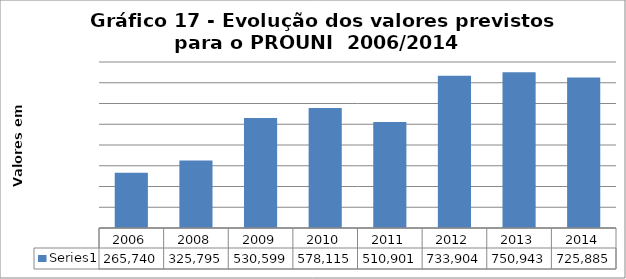
| Category | Series 0 |
|---|---|
| 2006.0 | 265740831 |
| 2008.0 | 325795326 |
| 2009.0 | 530599079 |
| 2010.0 | 578115899 |
| 2011.0 | 510901338 |
| 2012.0 | 733904013 |
| 2013.0 | 750943828 |
| 2014.0 | 725885270 |